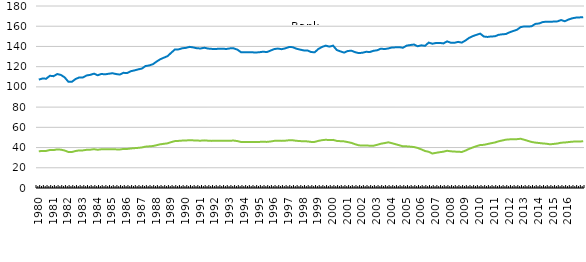
| Category | Bank | Non-banks |
|---|---|---|
| 1980 | 107.2 | 36.3 |
| 6 - 1980 | 108.3 | 36.7 |
| 9 - 1980 | 108.1 | 36.7 |
| 12 - 1980 | 111 | 37.6 |
| 1981 | 110.6 | 37.5 |
| 6 - 1981 | 112.7 | 38.2 |
| 9 - 1981 | 111.8 | 37.9 |
| 12 - 1981 | 109.5 | 37.1 |
| 1982 | 105.2 | 35.7 |
| 6 - 1982 | 105.1 | 35.6 |
| 9 - 1982 | 107.8 | 36.6 |
| 12 - 1982 | 109.4 | 37.2 |
| 1983 | 109.4 | 37.2 |
| 6 - 1983 | 111.3 | 37.8 |
| 9 - 1983 | 111.9 | 37.9 |
| 12 - 1983 | 113.1 | 38.4 |
| 1984 | 111.5 | 37.8 |
| 6 - 1984 | 112.8 | 38.3 |
| 9 - 1984 | 112.4 | 38.2 |
| 12 - 1984 | 113 | 38.3 |
| 1985 | 113.5 | 38.4 |
| 6 - 1985 | 112.7 | 38.2 |
| 9 - 1985 | 112.2 | 38.1 |
| 12 - 1985 | 113.9 | 38.6 |
| 1986 | 113.7 | 38.6 |
| 6 - 1986 | 115.5 | 39.1 |
| 9 - 1986 | 116.3 | 39.4 |
| 12 - 1986 | 117.3 | 39.7 |
| 1987 | 118.1 | 40.1 |
| 6 - 1987 | 120.6 | 40.9 |
| 9 - 1987 | 121.2 | 41.2 |
| 12 - 1987 | 122.4 | 41.5 |
| 1988 | 125 | 42.3 |
| 6 - 1988 | 127.3 | 43.2 |
| 9 - 1988 | 128.9 | 43.7 |
| 12 - 1988 | 130.4 | 44.2 |
| 1989 | 133.8 | 45.4 |
| 6 - 1989 | 137 | 46.4 |
| 9 - 1989 | 137.1 | 46.6 |
| 12 - 1989 | 138.2 | 46.9 |
| 1990 | 138.6 | 47 |
| 6 - 1990 | 139.6 | 47.3 |
| 9 - 1990 | 139 | 47.1 |
| 12 - 1990 | 138.2 | 46.9 |
| 1991 | 138 | 46.8 |
| 6 - 1991 | 138.7 | 47.1 |
| 9 - 1991 | 137.9 | 46.8 |
| 12 - 1991 | 137.6 | 46.6 |
| 1992 | 137.4 | 46.7 |
| 6 - 1992 | 137.8 | 46.7 |
| 9 - 1992 | 137.7 | 46.7 |
| 12 - 1992 | 137.5 | 46.7 |
| 1993 | 138.1 | 46.8 |
| 6 - 1993 | 138.1 | 46.9 |
| 9 - 1993 | 136.8 | 46.4 |
| 12 - 1993 | 134.2 | 45.5 |
| 1994 | 134.3 | 45.5 |
| 6 - 1994 | 134.2 | 45.6 |
| 9 - 1994 | 134.2 | 45.5 |
| 12 - 1994 | 134 | 45.5 |
| 1995 | 134.3 | 45.6 |
| 6 - 1995 | 134.8 | 45.7 |
| 9 - 1995 | 134.4 | 45.6 |
| 12 - 1995 | 135.9 | 46 |
| 1996 | 137.4 | 46.6 |
| 6 - 1996 | 137.9 | 46.8 |
| 9 - 1996 | 137.3 | 46.6 |
| 12 - 1996 | 138.1 | 46.8 |
| 1997 | 139.4 | 47.2 |
| 6 - 1997 | 139.3 | 47.2 |
| 9 - 1997 | 137.8 | 46.7 |
| 12 - 1997 | 136.9 | 46.4 |
| 1998 | 136.1 | 46.2 |
| 6 - 1998 | 136.1 | 46.1 |
| 9 - 1998 | 134.5 | 45.6 |
| 12 - 1998 | 134.2 | 45.6 |
| 1999 | 137.5 | 46.6 |
| 6 - 1999 | 139.5 | 47.3 |
| 9 - 1999 | 140.8 | 47.7 |
| 12 - 1999 | 139.8 | 47.4 |
| 2000 | 140.8 | 47.6 |
| 6 - 2000 | 136.5 | 46.6 |
| 9 - 2000 | 135.1 | 46.3 |
| 12 - 2000 | 133.9 | 46.1 |
| 2001 | 135.5 | 45.4 |
| 6 - 2001 | 135.8 | 44.6 |
| 9 - 2001 | 134.3 | 43.3 |
| 12 - 2001 | 133.4 | 42.2 |
| 2002 | 133.8 | 42 |
| 6 - 2002 | 134.7 | 42.1 |
| 9 - 2002 | 134.5 | 41.8 |
| 12 - 2002 | 135.7 | 41.8 |
| 2003 | 136.2 | 42.7 |
| 6 - 2003 | 137.8 | 43.8 |
| 9 - 2003 | 137.4 | 44.4 |
| 12 - 2003 | 138 | 45.2 |
| 2004 | 139 | 44.3 |
| 6 - 2004 | 139.1 | 43.3 |
| 9 - 2004 | 139.3 | 42.3 |
| 12 - 2004 | 138.7 | 41.2 |
| 2005 | 140.8 | 41.2 |
| 6 - 2005 | 141.4 | 40.9 |
| 9 - 2005 | 141.9 | 40.5 |
| 12 - 2005 | 140.2 | 39.6 |
| 2006 | 141.1 | 38.2 |
| 6 - 2006 | 140.6 | 36.6 |
| 9 - 2006 | 143.8 | 35.8 |
| 12 - 2006 | 142.7 | 34.1 |
| 2007 | 143.4 | 34.8 |
| 6 - 2007 | 143.5 | 35.4 |
| 9 - 2007 | 143 | 35.9 |
| 12 - 2007 | 145 | 36.8 |
| 2008 | 143.7 | 36.3 |
| 6 - 2008 | 143.6 | 36 |
| 9 - 2008 | 144.5 | 35.9 |
| 12 - 2008 | 143.8 | 35.6 |
| 2009 | 145.9 | 37 |
| 6 - 2009 | 148.5 | 38.7 |
| 9 - 2009 | 150.2 | 40.1 |
| 12 - 2009 | 151.5 | 41.4 |
| 2010 | 152.7 | 42.5 |
| 6 - 2010 | 149.8 | 42.7 |
| 9 - 2010 | 149.4 | 43.5 |
| 12 - 2010 | 149.9 | 44.3 |
| 2011 | 150 | 45 |
| 6 - 2011 | 151.5 | 46.2 |
| 9 - 2011 | 152 | 47 |
| 12 - 2011 | 152.3 | 47.8 |
| 2012 | 154 | 48.1 |
| 6 - 2012 | 155.3 | 48.2 |
| 9 - 2012 | 156.5 | 48.3 |
| 12 - 2012 | 159.1 | 48.7 |
| 2013 | 159.8 | 47.7 |
| 6 - 2013 | 159.6 | 46.6 |
| 9 - 2013 | 160 | 45.5 |
| 12 - 2013 | 162.3 | 44.9 |
| 2014 | 162.7 | 44.5 |
| 6 - 2014 | 164.1 | 44.1 |
| 9 - 2014 | 164.5 | 43.8 |
| 12 - 2014 | 164.4 | 43.2 |
| 2015 | 164.6 | 43.6 |
| 6 - 2015 | 164.8 | 44 |
| 9 - 2015 | 166.1 | 44.8 |
| 12 - 2015 | 164.9 | 45 |
| 2016 | 166.6 | 45.4 |
| 6 - 2016 | 167.8 | 45.8 |
| 9 - 2016 | 168.5 | 46 |